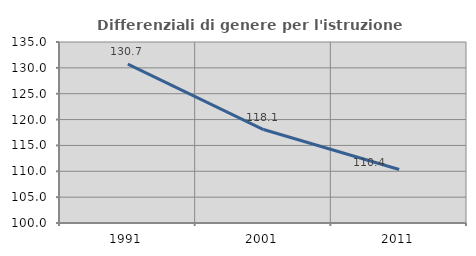
| Category | Differenziali di genere per l'istruzione superiore |
|---|---|
| 1991.0 | 130.725 |
| 2001.0 | 118.069 |
| 2011.0 | 110.352 |